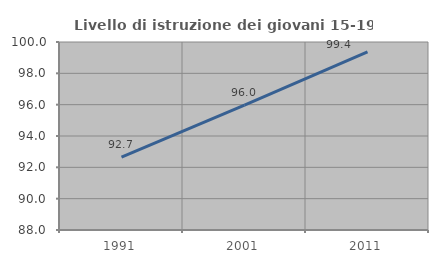
| Category | Livello di istruzione dei giovani 15-19 anni |
|---|---|
| 1991.0 | 92.653 |
| 2001.0 | 95.973 |
| 2011.0 | 99.363 |